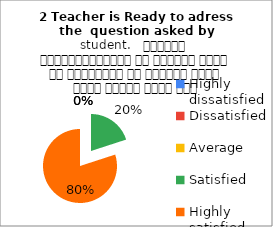
| Category | 2 Teacher is Ready to adress the  question asked by student.   शिक्षक विद्यार्थियों के द्वारा पूछे गए प्रश्नों का समाधान करने हेतु तत्पर रहते हैं |
|---|---|
| Highly dissatisfied | 0 |
| Dissatisfied | 0 |
| Average | 0 |
| Satisfied | 7 |
| Highly satisfied | 28 |